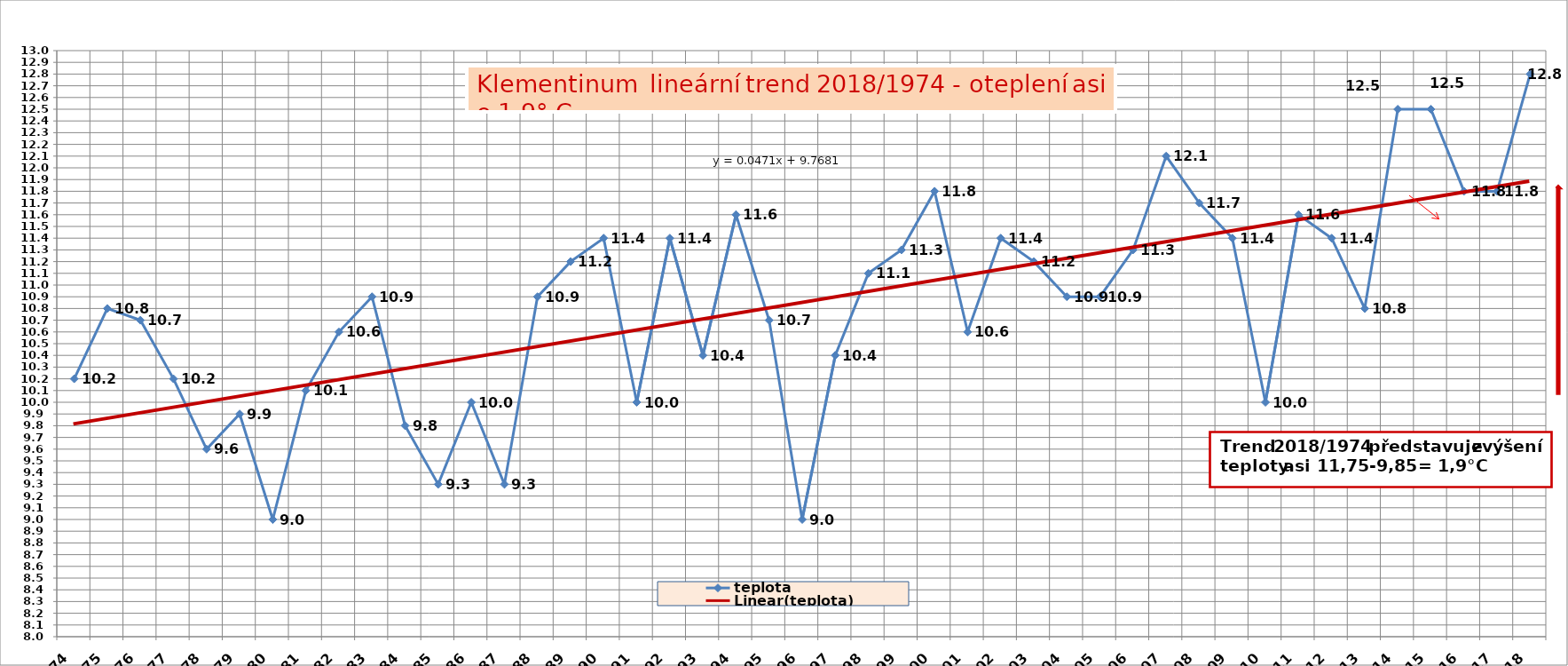
| Category | teplota |
|---|---|
| 1974 | 10.2 |
| 1975 | 10.8 |
| 1976 | 10.7 |
| 1977 | 10.2 |
| 1978 | 9.6 |
| 1979 | 9.9 |
| 1980 | 9 |
| 1981 | 10.1 |
| 1982 | 10.6 |
| 1983 | 10.9 |
| 1984 | 9.8 |
| 1985 | 9.3 |
| 1986 | 10 |
| 1987 | 9.3 |
| 1988 | 10.9 |
| 1989 | 11.2 |
| 1990 | 11.4 |
| 1991 | 10 |
| 1992 | 11.4 |
| 1993 | 10.4 |
| 1994 | 11.6 |
| 1995 | 10.7 |
| 1996 | 9 |
| 1997 | 10.4 |
| 1998 | 11.1 |
| 1999 | 11.3 |
| 2000 | 11.8 |
| 2001 | 10.6 |
| 2002 | 11.4 |
| 2003 | 11.2 |
| 2004 | 10.9 |
| 2005 | 10.9 |
| 2006 | 11.3 |
| 2007 | 12.1 |
| 2008 | 11.7 |
| 2009 | 11.4 |
| 2010 | 10 |
| 2011 | 11.6 |
| 2012 | 11.4 |
| 2013 | 10.8 |
| 2014 | 12.5 |
| 2015 | 12.5 |
| 2016 | 11.8 |
| 2017 | 11.8 |
| 2018 | 12.8 |